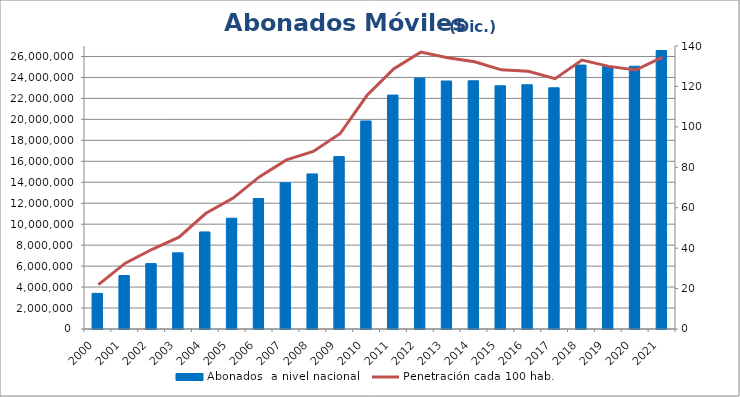
| Category | Abonados  a nivel nacional  |
|---|---|
| 2000.0 | 3401525 |
| 2001.0 | 5100783 |
| 2002.0 | 6244310 |
| 2003.0 | 7268281 |
| 2004.0 | 9261385 |
| 2005.0 | 10569572 |
| 2006.0 | 12450801 |
| 2007.0 | 13955202 |
| 2008.0 | 14796593 |
| 2009.0 | 16450223 |
| 2010.0 | 19852242 |
| 2011.0 | 22315248 |
| 2012.0 | 23940973 |
| 2013.0 | 23661339 |
| 2014.0 | 23680718 |
| 2015.0 | 23206353 |
| 2016.0 | 23302603 |
| 2017.0 | 23013147 |
| 2018.0 | 25178981 |
| 2019.0 | 25051668 |
| 2020.0 | 25068249 |
| 2021.0 | 26571823 |